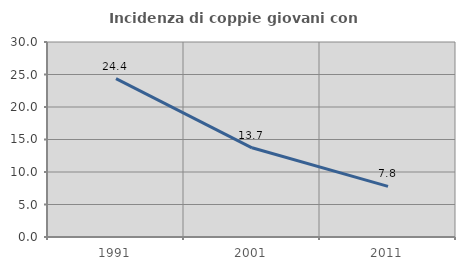
| Category | Incidenza di coppie giovani con figli |
|---|---|
| 1991.0 | 24.373 |
| 2001.0 | 13.72 |
| 2011.0 | 7.784 |